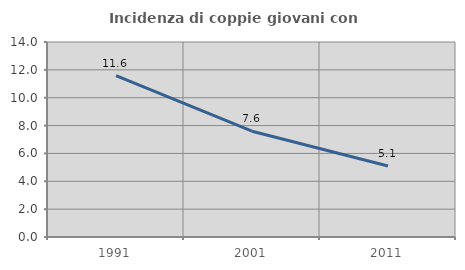
| Category | Incidenza di coppie giovani con figli |
|---|---|
| 1991.0 | 11.581 |
| 2001.0 | 7.595 |
| 2011.0 | 5.094 |